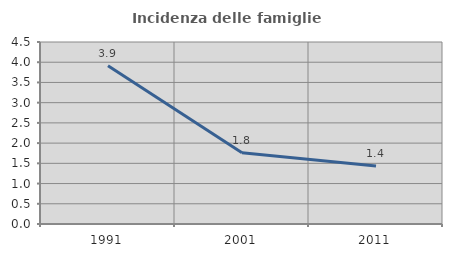
| Category | Incidenza delle famiglie numerose |
|---|---|
| 1991.0 | 3.915 |
| 2001.0 | 1.762 |
| 2011.0 | 1.435 |